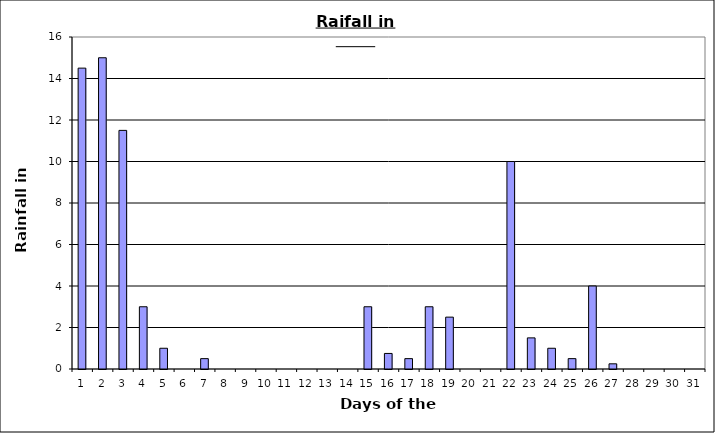
| Category | Series 0 |
|---|---|
| 0 | 14.5 |
| 1 | 15 |
| 2 | 11.5 |
| 3 | 3 |
| 4 | 1 |
| 5 | 0 |
| 6 | 0.5 |
| 7 | 0 |
| 8 | 0 |
| 9 | 0 |
| 10 | 0 |
| 11 | 0 |
| 12 | 0 |
| 13 | 0 |
| 14 | 3 |
| 15 | 0.75 |
| 16 | 0.5 |
| 17 | 3 |
| 18 | 2.5 |
| 19 | 0 |
| 20 | 0 |
| 21 | 10 |
| 22 | 1.5 |
| 23 | 1 |
| 24 | 0.5 |
| 25 | 4 |
| 26 | 0.25 |
| 27 | 0 |
| 28 | 0 |
| 29 | 0 |
| 30 | 0 |